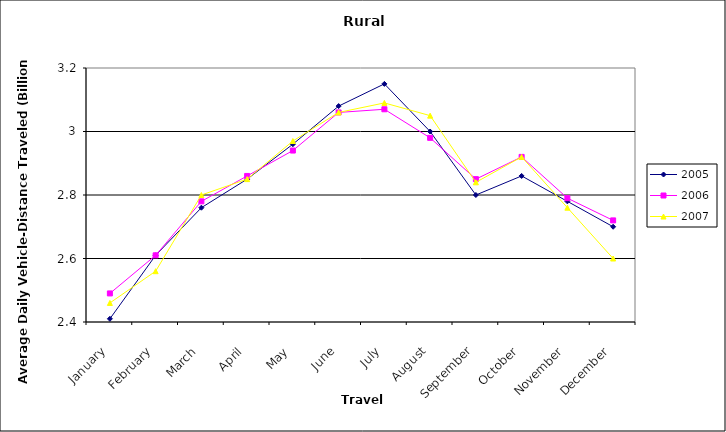
| Category | 2005 | 2006 | 2007 |
|---|---|---|---|
| January | 2.41 | 2.49 | 2.46 |
| February | 2.61 | 2.61 | 2.56 |
| March | 2.76 | 2.78 | 2.8 |
| April | 2.85 | 2.86 | 2.85 |
| May | 2.96 | 2.94 | 2.97 |
| June | 3.08 | 3.06 | 3.06 |
| July | 3.15 | 3.07 | 3.09 |
| August | 3 | 2.98 | 3.05 |
| September | 2.8 | 2.85 | 2.84 |
| October | 2.86 | 2.92 | 2.92 |
| November | 2.78 | 2.79 | 2.76 |
| December | 2.7 | 2.72 | 2.6 |